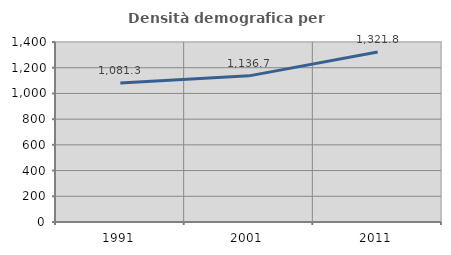
| Category | Densità demografica |
|---|---|
| 1991.0 | 1081.29 |
| 2001.0 | 1136.681 |
| 2011.0 | 1321.776 |